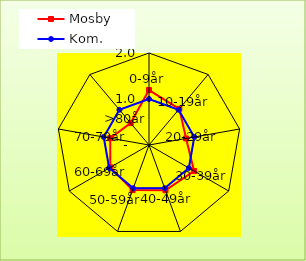
| Category | Mosby | Kom. |
|---|---|---|
| 0-9år | 1.194 | 1 |
| 10-19år | 1.026 | 1 |
| 20-29år | 0.819 | 1 |
| 30-39år | 1.132 | 1 |
| 40-49år | 1.048 | 1 |
| 50-59år | 1.043 | 1 |
| 60-69år | 0.972 | 1 |
| 70-79år | 0.856 | 1 |
| >80år | 0.621 | 1 |